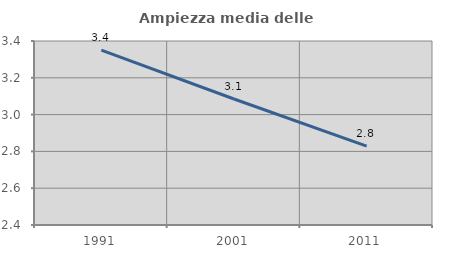
| Category | Ampiezza media delle famiglie |
|---|---|
| 1991.0 | 3.351 |
| 2001.0 | 3.085 |
| 2011.0 | 2.828 |